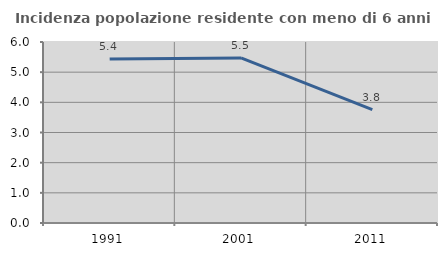
| Category | Incidenza popolazione residente con meno di 6 anni |
|---|---|
| 1991.0 | 5.434 |
| 2001.0 | 5.473 |
| 2011.0 | 3.758 |